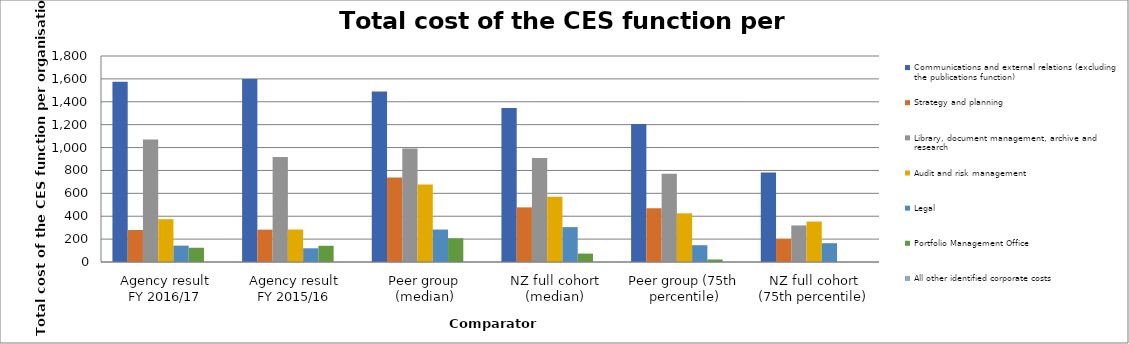
| Category | Communications and external relations (excluding the publications function) | Strategy and planning | Library, document management, archive and research | Audit and risk management | Legal | Portfolio Management Office | All other identified corporate costs |
|---|---|---|---|---|---|---|---|
| Agency result
FY 2016/17 | 1575.368 | 279.541 | 1069.986 | 373.893 | 143.033 | 124.464 | 0 |
| Agency result
FY 2015/16 | 1599.461 | 282.654 | 916.422 | 283.692 | 119.804 | 141.586 | 0 |
| Peer group (median) | 1489.518 | 738.607 | 991.098 | 676.454 | 283.722 | 207.211 | 0 |
| NZ full cohort (median) | 1345.334 | 477.472 | 908.602 | 570.473 | 304.794 | 73.411 | 0 |
| Peer group (75th percentile) | 1206.753 | 469.701 | 772.176 | 425.004 | 146.582 | 22.098 | 0 |
| NZ full cohort (75th percentile) | 781.241 | 201.378 | 319.502 | 353.49 | 164.219 | 0 | 0 |